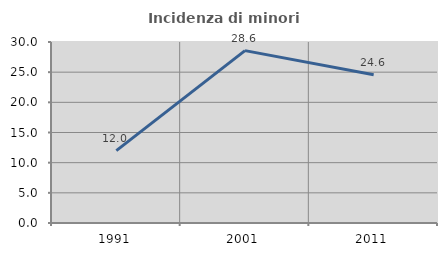
| Category | Incidenza di minori stranieri |
|---|---|
| 1991.0 | 12 |
| 2001.0 | 28.571 |
| 2011.0 | 24.556 |